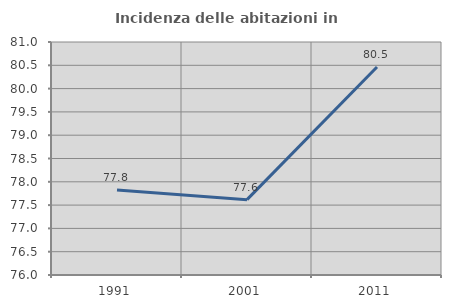
| Category | Incidenza delle abitazioni in proprietà  |
|---|---|
| 1991.0 | 77.823 |
| 2001.0 | 77.617 |
| 2011.0 | 80.464 |